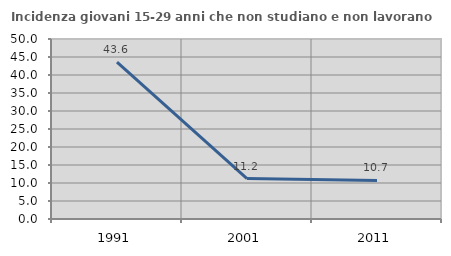
| Category | Incidenza giovani 15-29 anni che non studiano e non lavorano  |
|---|---|
| 1991.0 | 43.568 |
| 2001.0 | 11.224 |
| 2011.0 | 10.714 |